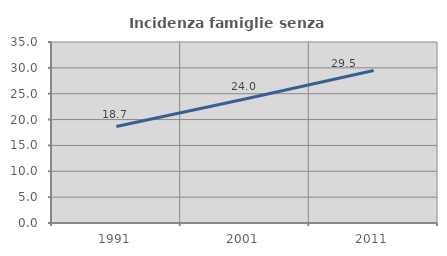
| Category | Incidenza famiglie senza nuclei |
|---|---|
| 1991.0 | 18.659 |
| 2001.0 | 23.983 |
| 2011.0 | 29.477 |